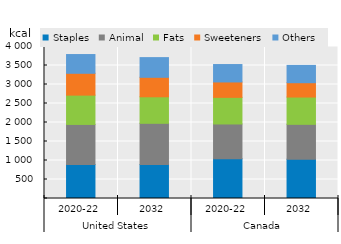
| Category | Staples | Animal | Fats | Sweeteners | Others  |
|---|---|---|---|---|---|
| 0 | 897.991 | 1051.224 | 771.115 | 574.601 | 493.417 |
| 1 | 895.595 | 1083.019 | 698.07 | 512.618 | 518.244 |
| 2 | 1043.995 | 917.102 | 700.431 | 405.641 | 458.257 |
| 3 | 1029.712 | 921.798 | 718.209 | 377.365 | 455.837 |